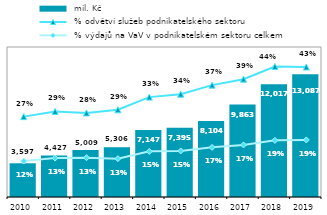
| Category |  mil. Kč |
|---|---|
| 2010.0 | 3597.172 |
| 2011.0 | 4426.887 |
| 2012.0 | 5009.133 |
| 2013.0 | 5305.793 |
| 2014.0 | 7146.732 |
| 2015.0 | 7394.736 |
| 2016.0 | 8103.91 |
| 2017.0 | 9863.017 |
| 2018.0 | 12016.964 |
| 2019.0 | 13086.503 |